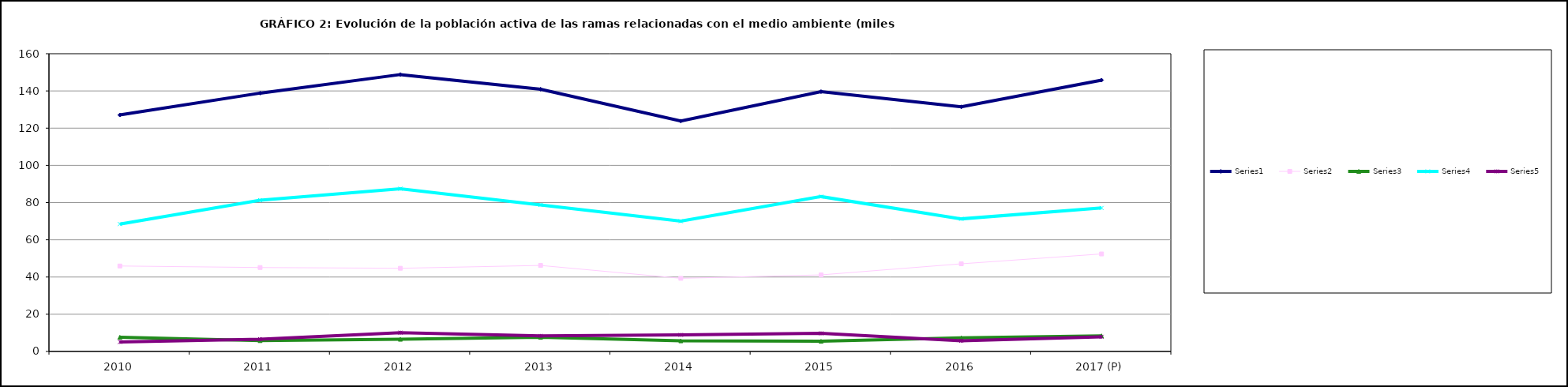
| Category | Series 0 | Series 1 | Series 2 | Series 3 | Series 4 |
|---|---|---|---|---|---|
| 2010 | 127.075 | 45.925 | 7.65 | 68.45 | 5.1 |
| 2011 | 138.825 | 45.1 | 5.825 | 81.275 | 6.6 |
| 2012 | 148.8 | 44.7 | 6.55 | 87.45 | 10.125 |
| 2013 | 140.925 | 46.225 | 7.625 | 78.75 | 8.35 |
| 2014 | 123.8 | 39.3 | 5.7 | 70 | 8.9 |
| 2015 | 139.625 | 41.15 | 5.5 | 83.225 | 9.75 |
| 2016 | 131.45 | 47.1 | 7.33 | 71.25 | 5.75 |
| 2017 (P) | 145.8 | 52.4 | 8.4 | 77.1 | 7.9 |